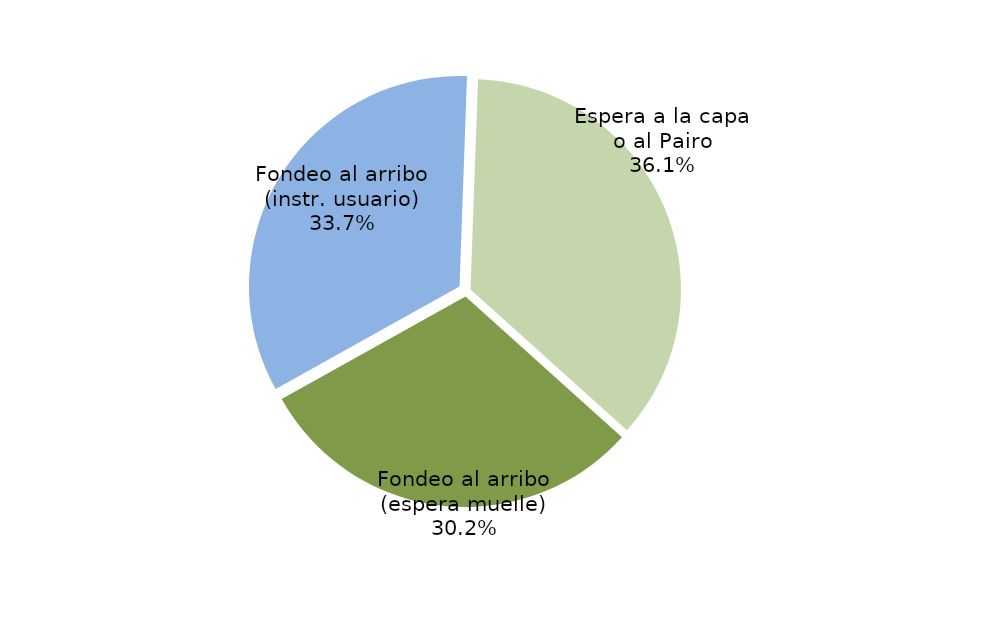
| Category | Series 0 |
|---|---|
| Fondeo al arribo (espera muelle) | 5230.583 |
| Fondeo al arribo (instr. usuario) | 5825.167 |
| Espera a la capa o al Pairo | 6245.217 |